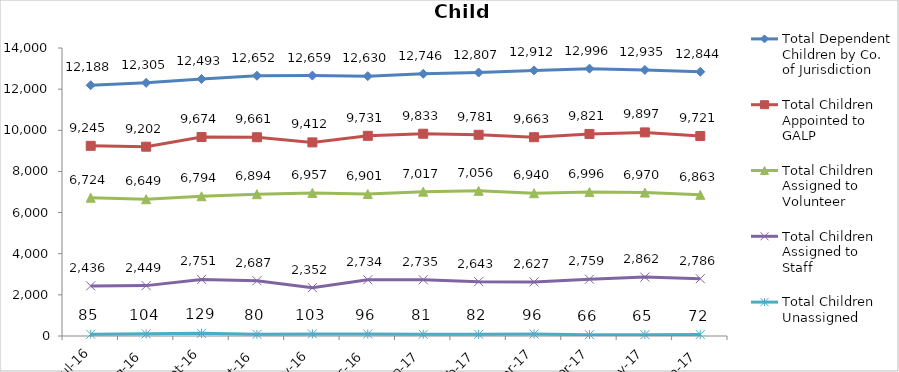
| Category | Total Dependent Children by Co. of Jurisdiction | Total Children Appointed to GALP | Total Children Assigned to Volunteer | Total Children Assigned to Staff | Total Children Unassigned |
|---|---|---|---|---|---|
| Jul-16 | 12188 | 9245 | 6724 | 2436 | 85 |
| Aug-16 | 12305 | 9202 | 6649 | 2449 | 104 |
| Sep-16 | 12493 | 9674 | 6794 | 2751 | 129 |
| Oct-16 | 12652 | 9661 | 6894 | 2687 | 80 |
| Nov-16 | 12659 | 9412 | 6957 | 2352 | 103 |
| Dec-16 | 12630 | 9731 | 6901 | 2734 | 96 |
| Jan-17 | 12746 | 9833 | 7017 | 2735 | 81 |
| Feb-17 | 12807 | 9781 | 7056 | 2643 | 82 |
| Mar-17 | 12912 | 9663 | 6940 | 2627 | 96 |
| Apr-17 | 12996 | 9821 | 6996 | 2759 | 66 |
| May-17 | 12935 | 9897 | 6970 | 2862 | 65 |
| Jun-17 | 12844 | 9721 | 6863 | 2786 | 72 |